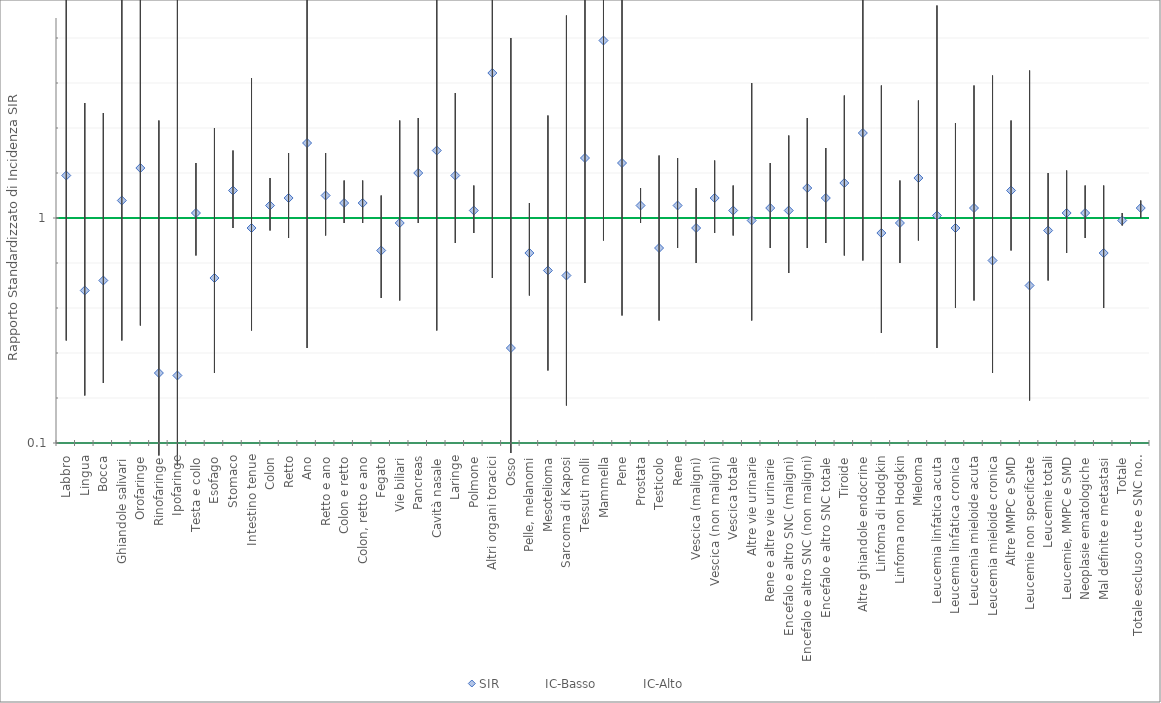
| Category | SIR | IC-Basso | IC-Alto |
|---|---|---|---|
| Labbro | 1.17 | 0.51 | 2.31 |
| Lingua | 0.71 | 0.29 | 1.46 |
| Bocca | 0.75 | 0.34 | 1.42 |
| Ghiandole salivari | 1.07 | 0.51 | 1.97 |
| Orofaringe | 1.2 | 0.57 | 2.2 |
| Rinofaringe | 0.38 | 0.05 | 1.39 |
| Ipofaringe | 0.37 | 0.01 | 2.06 |
| Testa e collo | 1.02 | 0.85 | 1.22 |
| Esofago | 0.76 | 0.38 | 1.36 |
| Stomaco | 1.11 | 0.96 | 1.27 |
| Intestino tenue | 0.96 | 0.55 | 1.56 |
| Colon | 1.05 | 0.95 | 1.16 |
| Retto | 1.08 | 0.92 | 1.26 |
| Ano | 1.3 | 0.48 | 2.83 |
| Retto e ano | 1.09 | 0.93 | 1.26 |
| Colon e retto | 1.06 | 0.98 | 1.15 |
| Colon, retto e ano | 1.06 | 0.98 | 1.15 |
| Fegato | 0.87 | 0.68 | 1.09 |
| Vie biliari | 0.98 | 0.67 | 1.39 |
| Pancreas | 1.18 | 0.98 | 1.4 |
| Cavità nasale | 1.27 | 0.55 | 2.51 |
| Laringe | 1.17 | 0.9 | 1.5 |
| Polmone | 1.03 | 0.94 | 1.13 |
| Altri organi toracici | 1.58 | 0.76 | 2.91 |
| Osso | 0.48 | 0.06 | 1.72 |
| Pelle, melanomi | 0.86 | 0.69 | 1.06 |
| Mesotelioma | 0.79 | 0.39 | 1.41 |
| Sarcoma di Kaposi | 0.77 | 0.25 | 1.81 |
| Tessuti molli | 1.24 | 0.74 | 1.96 |
| Mammella | 1.71 | 0.91 | 2.92 |
| Pene | 1.22 | 0.61 | 2.18 |
| Prostata | 1.05 | 0.98 | 1.12 |
| Testicolo | 0.88 | 0.59 | 1.25 |
| Rene | 1.05 | 0.88 | 1.24 |
| Vescica (maligni) | 0.96 | 0.82 | 1.12 |
| Vescica (non maligni) | 1.08 | 0.94 | 1.23 |
| Vescica totale | 1.03 | 0.93 | 1.13 |
| Altre vie urinarie | 0.99 | 0.59 | 1.54 |
| Rene e altre vie urinarie | 1.04 | 0.88 | 1.22 |
| Encefalo e altro SNC (maligni) | 1.03 | 0.78 | 1.33 |
| Encefalo e altro SNC (non maligni) | 1.12 | 0.88 | 1.4 |
| Encefalo e altro SNC totale | 1.08 | 0.9 | 1.28 |
| Tiroide | 1.14 | 0.85 | 1.49 |
| Altre ghiandole endocrine | 1.34 | 0.83 | 2.06 |
| Linfoma di Hodgkin | 0.94 | 0.54 | 1.53 |
| Linfoma non Hodgkin | 0.98 | 0.82 | 1.15 |
| Mieloma | 1.16 | 0.91 | 1.47 |
| Leucemia linfatica acuta | 1.01 | 0.48 | 1.85 |
| Leucemia linfatica cronica | 0.96 | 0.64 | 1.38 |
| Leucemia mieloide acuta | 1.04 | 0.67 | 1.53 |
| Leucemia mieloide cronica | 0.83 | 0.38 | 1.57 |
| Altre MMPC e SMD | 1.11 | 0.87 | 1.39 |
| Leucemie non specificate | 0.73 | 0.27 | 1.59 |
| Leucemie totali | 0.95 | 0.75 | 1.18 |
| Leucemie, MMPC e SMD | 1.02 | 0.86 | 1.19 |
| Neoplasie ematologiche | 1.02 | 0.92 | 1.13 |
| Mal definite e metastasi | 0.86 | 0.64 | 1.13 |
| Totale | 0.99 | 0.97 | 1.02 |
| Totale escluso cute e SNC non maligno | 1.04 | 1 | 1.07 |